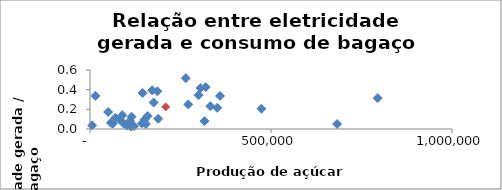
| Category | MWh gerado / t bagaço |
|---|---|
| 70006.65 | 0.113 |
| 186093.0 | 0.383 |
| 319615.0 | 0.426 |
| 359096.55 | 0.336 |
| 143551.0 | 0.058 |
| 114752.0 | 0.125 |
| 171877.0 | 0.394 |
| 264721.0 | 0.517 |
| 188278.0 | 0.104 |
| 316300.0 | 0.08 |
| 682500.0 | 0.051 |
| 271424.0 | 0.249 |
| 15000.0 | 0.337 |
| 110416.5 | 0.083 |
| 102893.0 | 0.035 |
| 81621.0 | 0.096 |
| 50000.0 | 0.173 |
| 332500.0 | 0.231 |
| 63000.0 | 0.055 |
| 150820.61 | 0.095 |
| 473527.0 | 0.206 |
| 5852.17 | 0.037 |
| 351434.0 | 0.216 |
| 154544.0 | 0.051 |
| 93442.0 | 0.054 |
| 159076.0 | 0.131 |
| 175898.0 | 0.27 |
| 113212.0 | 0.025 |
| 121590.0 | 0.029 |
| 89000.0 | 0.141 |
| 300000.0 | 0.344 |
| 794644.0 | 0.314 |
| 57750.0 | 0.063 |
| 305311.0 | 0.416 |
| 145381.9 | 0.366 |
| 209575.06800000003 | 0.225 |